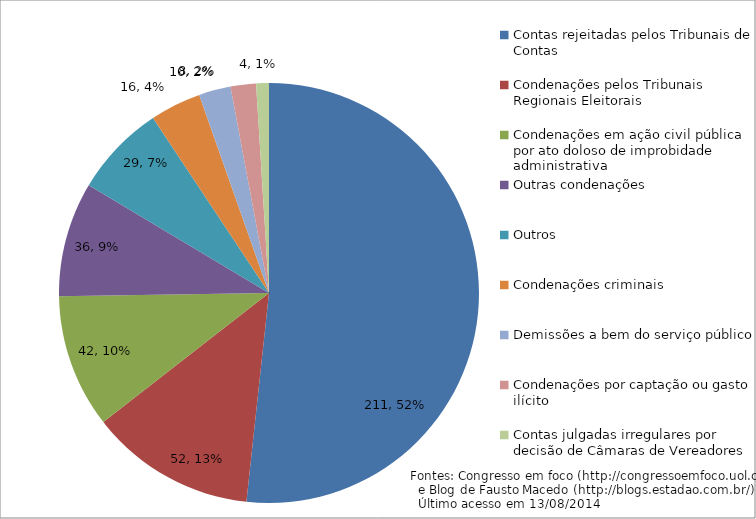
| Category | Series 0 |
|---|---|
| Contas rejeitadas pelos Tribunais de Contas | 211 |
| Condenações pelos Tribunais Regionais Eleitorais | 52 |
| Condenações em ação civil pública por ato doloso de improbidade administrativa | 42 |
| Outras condenações | 36 |
| Outros | 29 |
| Condenações criminais | 16 |
| Demissões a bem do serviço público | 10 |
| Condenações por captação ou gasto ilícito | 8 |
| Contas julgadas irregulares por decisão de Câmaras de Vereadores | 4 |